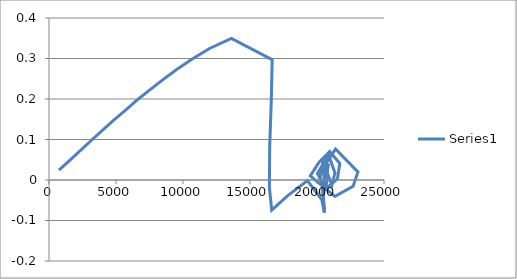
| Category | Series 0 |
|---|---|
| 744.88904 | 0.024 |
| 1569.2601 | 0.049 |
| 2392.3281 | 0.074 |
| 3211.4875 | 0.099 |
| 4044.1211 | 0.124 |
| 4894.8706 | 0.149 |
| 5784.3579 | 0.174 |
| 6644.8022 | 0.199 |
| 7595.9727 | 0.225 |
| 8580.2715 | 0.25 |
| 9603.1055 | 0.275 |
| 10720.064 | 0.3 |
| 11981.619 | 0.325 |
| 13608.424 | 0.35 |
| 16654.604 | 0.297 |
| 16590.176 | 0.199 |
| 16468.299 | 0.08 |
| 16447.15 | -0.018 |
| 16619.736 | -0.075 |
| 17750.855 | -0.04 |
| 19285.027 | -0.002 |
| 20360.914 | -0.049 |
| 20554.094 | -0.08 |
| 20417.539 | -0.017 |
| 20686.008 | 0.041 |
| 21381.986 | 0.077 |
| 23055.064 | 0.02 |
| 22699.262 | -0.015 |
| 21337.914 | -0.04 |
| 19498.686 | 0.01 |
| 20155.805 | 0.044 |
| 20945.646 | 0.07 |
| 21701.08 | 0.041 |
| 21523.096 | 0.003 |
| 20597.951 | -0.023 |
| 20035.111 | 0.016 |
| 20867.617 | 0.062 |
| 21340.131 | 0.017 |
| 21109.287 | -0.012 |
| 20795.418 | 0.015 |
| 20482.129 | 0.048 |
| 20220.785 | 0.005 |
| 20446.111 | 0.032 |
| 20775.598 | 0.002 |
| 20630.963 | -0.023 |
| 20557.758 | 0.015 |
| 20843.539 | 0.04 |
| 20735.648 | 0.014 |